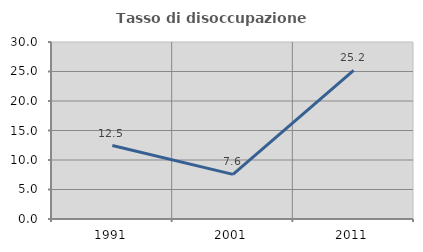
| Category | Tasso di disoccupazione giovanile  |
|---|---|
| 1991.0 | 12.454 |
| 2001.0 | 7.558 |
| 2011.0 | 25.197 |